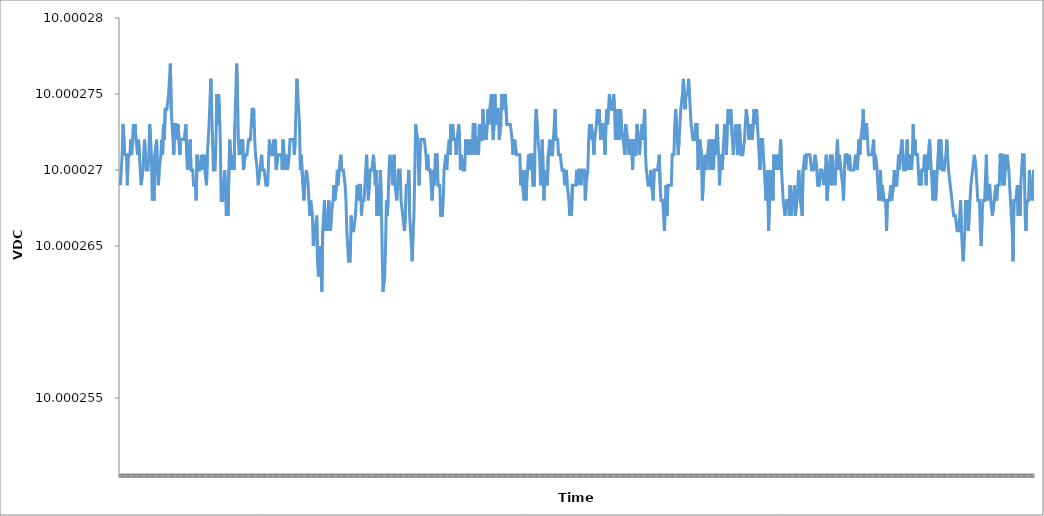
| Category | Channel 1 (VDC) |
|---|---|
| 0 | 10 |
| 1 | 10 |
| 2 | 10 |
| 3 | 10 |
| 4 | 10 |
| 5 | 10 |
| 6 | 10 |
| 7 | 10 |
| 8 | 10 |
| 9 | 10 |
| 10 | 10 |
| 11 | 10 |
| 12 | 10 |
| 13 | 10 |
| 14 | 10 |
| 15 | 10 |
| 16 | 10 |
| 17 | 10 |
| 18 | 10 |
| 19 | 10 |
| 20 | 10 |
| 21 | 10 |
| 22 | 10 |
| 23 | 10 |
| 24 | 10 |
| 25 | 10 |
| 26 | 10 |
| 27 | 10 |
| 28 | 10 |
| 29 | 10 |
| 30 | 10 |
| 31 | 10 |
| 32 | 10 |
| 33 | 10 |
| 34 | 10 |
| 35 | 10 |
| 36 | 10 |
| 37 | 10 |
| 38 | 10 |
| 39 | 10 |
| 40 | 10 |
| 41 | 10 |
| 42 | 10 |
| 43 | 10 |
| 44 | 10 |
| 45 | 10 |
| 46 | 10 |
| 47 | 10 |
| 48 | 10 |
| 49 | 10 |
| 50 | 10 |
| 51 | 10 |
| 52 | 10 |
| 53 | 10 |
| 54 | 10 |
| 55 | 10 |
| 56 | 10 |
| 57 | 10 |
| 58 | 10 |
| 59 | 10 |
| 60 | 10 |
| 61 | 10 |
| 62 | 10 |
| 63 | 10 |
| 64 | 10 |
| 65 | 10 |
| 66 | 10 |
| 67 | 10 |
| 68 | 10 |
| 69 | 10 |
| 70 | 10 |
| 71 | 10 |
| 72 | 10 |
| 73 | 10 |
| 74 | 10 |
| 75 | 10 |
| 76 | 10 |
| 77 | 10 |
| 78 | 10 |
| 79 | 10 |
| 80 | 10 |
| 81 | 10 |
| 82 | 10 |
| 83 | 10 |
| 84 | 10 |
| 85 | 10 |
| 86 | 10 |
| 87 | 10 |
| 88 | 10 |
| 89 | 10 |
| 90 | 10 |
| 91 | 10 |
| 92 | 10 |
| 93 | 10 |
| 94 | 10 |
| 95 | 10 |
| 96 | 10 |
| 97 | 10 |
| 98 | 10 |
| 99 | 10 |
| 100 | 10 |
| 101 | 10 |
| 102 | 10 |
| 103 | 10 |
| 104 | 10 |
| 105 | 10 |
| 106 | 10 |
| 107 | 10 |
| 108 | 10 |
| 109 | 10 |
| 110 | 10 |
| 111 | 10 |
| 112 | 10 |
| 113 | 10 |
| 114 | 10 |
| 115 | 10 |
| 116 | 10 |
| 117 | 10 |
| 118 | 10 |
| 119 | 10 |
| 120 | 10 |
| 121 | 10 |
| 122 | 10 |
| 123 | 10 |
| 124 | 10 |
| 125 | 10 |
| 126 | 10 |
| 127 | 10 |
| 128 | 10 |
| 129 | 10 |
| 130 | 10 |
| 131 | 10 |
| 132 | 10 |
| 133 | 10 |
| 134 | 10 |
| 135 | 10 |
| 136 | 10 |
| 137 | 10 |
| 138 | 10 |
| 139 | 10 |
| 140 | 10 |
| 141 | 10 |
| 142 | 10 |
| 143 | 10 |
| 144 | 10 |
| 145 | 10 |
| 146 | 10 |
| 147 | 10 |
| 148 | 10 |
| 149 | 10 |
| 150 | 10 |
| 151 | 10 |
| 152 | 10 |
| 153 | 10 |
| 154 | 10 |
| 155 | 10 |
| 156 | 10 |
| 157 | 10 |
| 158 | 10 |
| 159 | 10 |
| 160 | 10 |
| 161 | 10 |
| 162 | 10 |
| 163 | 10 |
| 164 | 10 |
| 165 | 10 |
| 166 | 10 |
| 167 | 10 |
| 168 | 10 |
| 169 | 10 |
| 170 | 10 |
| 171 | 10 |
| 172 | 10 |
| 173 | 10 |
| 174 | 10 |
| 175 | 10 |
| 176 | 10 |
| 177 | 10 |
| 178 | 10 |
| 179 | 10 |
| 180 | 10 |
| 181 | 10 |
| 182 | 10 |
| 183 | 10 |
| 184 | 10 |
| 185 | 10 |
| 186 | 10 |
| 187 | 10 |
| 188 | 10 |
| 189 | 10 |
| 190 | 10 |
| 191 | 10 |
| 192 | 10 |
| 193 | 10 |
| 194 | 10 |
| 195 | 10 |
| 196 | 10 |
| 197 | 10 |
| 198 | 10 |
| 199 | 10 |
| 200 | 10 |
| 201 | 10 |
| 202 | 10 |
| 203 | 10 |
| 204 | 10 |
| 205 | 10 |
| 206 | 10 |
| 207 | 10 |
| 208 | 10 |
| 209 | 10 |
| 210 | 10 |
| 211 | 10 |
| 212 | 10 |
| 213 | 10 |
| 214 | 10 |
| 215 | 10 |
| 216 | 10 |
| 217 | 10 |
| 218 | 10 |
| 219 | 10 |
| 220 | 10 |
| 221 | 10 |
| 222 | 10 |
| 223 | 10 |
| 224 | 10 |
| 225 | 10 |
| 226 | 10 |
| 227 | 10 |
| 228 | 10 |
| 229 | 10 |
| 230 | 10 |
| 231 | 10 |
| 232 | 10 |
| 233 | 10 |
| 234 | 10 |
| 235 | 10 |
| 236 | 10 |
| 237 | 10 |
| 238 | 10 |
| 239 | 10 |
| 240 | 10 |
| 241 | 10 |
| 242 | 10 |
| 243 | 10 |
| 244 | 10 |
| 245 | 10 |
| 246 | 10 |
| 247 | 10 |
| 248 | 10 |
| 249 | 10 |
| 250 | 10 |
| 251 | 10 |
| 252 | 10 |
| 253 | 10 |
| 254 | 10 |
| 255 | 10 |
| 256 | 10 |
| 257 | 10 |
| 258 | 10 |
| 259 | 10 |
| 260 | 10 |
| 261 | 10 |
| 262 | 10 |
| 263 | 10 |
| 264 | 10 |
| 265 | 10 |
| 266 | 10 |
| 267 | 10 |
| 268 | 10 |
| 269 | 10 |
| 270 | 10 |
| 271 | 10 |
| 272 | 10 |
| 273 | 10 |
| 274 | 10 |
| 275 | 10 |
| 276 | 10 |
| 277 | 10 |
| 278 | 10 |
| 279 | 10 |
| 280 | 10 |
| 281 | 10 |
| 282 | 10 |
| 283 | 10 |
| 284 | 10 |
| 285 | 10 |
| 286 | 10 |
| 287 | 10 |
| 288 | 10 |
| 289 | 10 |
| 290 | 10 |
| 291 | 10 |
| 292 | 10 |
| 293 | 10 |
| 294 | 10 |
| 295 | 10 |
| 296 | 10 |
| 297 | 10 |
| 298 | 10 |
| 299 | 10 |
| 300 | 10 |
| 301 | 10 |
| 302 | 10 |
| 303 | 10 |
| 304 | 10 |
| 305 | 10 |
| 306 | 10 |
| 307 | 10 |
| 308 | 10 |
| 309 | 10 |
| 310 | 10 |
| 311 | 10 |
| 312 | 10 |
| 313 | 10 |
| 314 | 10 |
| 315 | 10 |
| 316 | 10 |
| 317 | 10 |
| 318 | 10 |
| 319 | 10 |
| 320 | 10 |
| 321 | 10 |
| 322 | 10 |
| 323 | 10 |
| 324 | 10 |
| 325 | 10 |
| 326 | 10 |
| 327 | 10 |
| 328 | 10 |
| 329 | 10 |
| 330 | 10 |
| 331 | 10 |
| 332 | 10 |
| 333 | 10 |
| 334 | 10 |
| 335 | 10 |
| 336 | 10 |
| 337 | 10 |
| 338 | 10 |
| 339 | 10 |
| 340 | 10 |
| 341 | 10 |
| 342 | 10 |
| 343 | 10 |
| 344 | 10 |
| 345 | 10 |
| 346 | 10 |
| 347 | 10 |
| 348 | 10 |
| 349 | 10 |
| 350 | 10 |
| 351 | 10 |
| 352 | 10 |
| 353 | 10 |
| 354 | 10 |
| 355 | 10 |
| 356 | 10 |
| 357 | 10 |
| 358 | 10 |
| 359 | 10 |
| 360 | 10 |
| 361 | 10 |
| 362 | 10 |
| 363 | 10 |
| 364 | 10 |
| 365 | 10 |
| 366 | 10 |
| 367 | 10 |
| 368 | 10 |
| 369 | 10 |
| 370 | 10 |
| 371 | 10 |
| 372 | 10 |
| 373 | 10 |
| 374 | 10 |
| 375 | 10 |
| 376 | 10 |
| 377 | 10 |
| 378 | 10 |
| 379 | 10 |
| 380 | 10 |
| 381 | 10 |
| 382 | 10 |
| 383 | 10 |
| 384 | 10 |
| 385 | 10 |
| 386 | 10 |
| 387 | 10 |
| 388 | 10 |
| 389 | 10 |
| 390 | 10 |
| 391 | 10 |
| 392 | 10 |
| 393 | 10 |
| 394 | 10 |
| 395 | 10 |
| 396 | 10 |
| 397 | 10 |
| 398 | 10 |
| 399 | 10 |
| 400 | 10 |
| 401 | 10 |
| 402 | 10 |
| 403 | 10 |
| 404 | 10 |
| 405 | 10 |
| 406 | 10 |
| 407 | 10 |
| 408 | 10 |
| 409 | 10 |
| 410 | 10 |
| 411 | 10 |
| 412 | 10 |
| 413 | 10 |
| 414 | 10 |
| 415 | 10 |
| 416 | 10 |
| 417 | 10 |
| 418 | 10 |
| 419 | 10 |
| 420 | 10 |
| 421 | 10 |
| 422 | 10 |
| 423 | 10 |
| 424 | 10 |
| 425 | 10 |
| 426 | 10 |
| 427 | 10 |
| 428 | 10 |
| 429 | 10 |
| 430 | 10 |
| 431 | 10 |
| 432 | 10 |
| 433 | 10 |
| 434 | 10 |
| 435 | 10 |
| 436 | 10 |
| 437 | 10 |
| 438 | 10 |
| 439 | 10 |
| 440 | 10 |
| 441 | 10 |
| 442 | 10 |
| 443 | 10 |
| 444 | 10 |
| 445 | 10 |
| 446 | 10 |
| 447 | 10 |
| 448 | 10 |
| 449 | 10 |
| 450 | 10 |
| 451 | 10 |
| 452 | 10 |
| 453 | 10 |
| 454 | 10 |
| 455 | 10 |
| 456 | 10 |
| 457 | 10 |
| 458 | 10 |
| 459 | 10 |
| 460 | 10 |
| 461 | 10 |
| 462 | 10 |
| 463 | 10 |
| 464 | 10 |
| 465 | 10 |
| 466 | 10 |
| 467 | 10 |
| 468 | 10 |
| 469 | 10 |
| 470 | 10 |
| 471 | 10 |
| 472 | 10 |
| 473 | 10 |
| 474 | 10 |
| 475 | 10 |
| 476 | 10 |
| 477 | 10 |
| 478 | 10 |
| 479 | 10 |
| 480 | 10 |
| 481 | 10 |
| 482 | 10 |
| 483 | 10 |
| 484 | 10 |
| 485 | 10 |
| 486 | 10 |
| 487 | 10 |
| 488 | 10 |
| 489 | 10 |
| 490 | 10 |
| 491 | 10 |
| 492 | 10 |
| 493 | 10 |
| 494 | 10 |
| 495 | 10 |
| 496 | 10 |
| 497 | 10 |
| 498 | 10 |
| 499 | 10 |
| 500 | 10 |
| 501 | 10 |
| 502 | 10 |
| 503 | 10 |
| 504 | 10 |
| 505 | 10 |
| 506 | 10 |
| 507 | 10 |
| 508 | 10 |
| 509 | 10 |
| 510 | 10 |
| 511 | 10 |
| 512 | 10 |
| 513 | 10 |
| 514 | 10 |
| 515 | 10 |
| 516 | 10 |
| 517 | 10 |
| 518 | 10 |
| 519 | 10 |
| 520 | 10 |
| 521 | 10 |
| 522 | 10 |
| 523 | 10 |
| 524 | 10 |
| 525 | 10 |
| 526 | 10 |
| 527 | 10 |
| 528 | 10 |
| 529 | 10 |
| 530 | 10 |
| 531 | 10 |
| 532 | 10 |
| 533 | 10 |
| 534 | 10 |
| 535 | 10 |
| 536 | 10 |
| 537 | 10 |
| 538 | 10 |
| 539 | 10 |
| 540 | 10 |
| 541 | 10 |
| 542 | 10 |
| 543 | 10 |
| 544 | 10 |
| 545 | 10 |
| 546 | 10 |
| 547 | 10 |
| 548 | 10 |
| 549 | 10 |
| 550 | 10 |
| 551 | 10 |
| 552 | 10 |
| 553 | 10 |
| 554 | 10 |
| 555 | 10 |
| 556 | 10 |
| 557 | 10 |
| 558 | 10 |
| 559 | 10 |
| 560 | 10 |
| 561 | 10 |
| 562 | 10 |
| 563 | 10 |
| 564 | 10 |
| 565 | 10 |
| 566 | 10 |
| 567 | 10 |
| 568 | 10 |
| 569 | 10 |
| 570 | 10 |
| 571 | 10 |
| 572 | 10 |
| 573 | 10 |
| 574 | 10 |
| 575 | 10 |
| 576 | 10 |
| 577 | 10 |
| 578 | 10 |
| 579 | 10 |
| 580 | 10 |
| 581 | 10 |
| 582 | 10 |
| 583 | 10 |
| 584 | 10 |
| 585 | 10 |
| 586 | 10 |
| 587 | 10 |
| 588 | 10 |
| 589 | 10 |
| 590 | 10 |
| 591 | 10 |
| 592 | 10 |
| 593 | 10 |
| 594 | 10 |
| 595 | 10 |
| 596 | 10 |
| 597 | 10 |
| 598 | 10 |
| 599 | 10 |
| 600 | 10 |
| 601 | 10 |
| 602 | 10 |
| 603 | 10 |
| 604 | 10 |
| 605 | 10 |
| 606 | 10 |
| 607 | 10 |
| 608 | 10 |
| 609 | 10 |
| 610 | 10 |
| 611 | 10 |
| 612 | 10 |
| 613 | 10 |
| 614 | 10 |
| 615 | 10 |
| 616 | 10 |
| 617 | 10 |
| 618 | 10 |
| 619 | 10 |
| 620 | 10 |
| 621 | 10 |
| 622 | 10 |
| 623 | 10 |
| 624 | 10 |
| 625 | 10 |
| 626 | 10 |
| 627 | 10 |
| 628 | 10 |
| 629 | 10 |
| 630 | 10 |
| 631 | 10 |
| 632 | 10 |
| 633 | 10 |
| 634 | 10 |
| 635 | 10 |
| 636 | 10 |
| 637 | 10 |
| 638 | 10 |
| 639 | 10 |
| 640 | 10 |
| 641 | 10 |
| 642 | 10 |
| 643 | 10 |
| 644 | 10 |
| 645 | 10 |
| 646 | 10 |
| 647 | 10 |
| 648 | 10 |
| 649 | 10 |
| 650 | 10 |
| 651 | 10 |
| 652 | 10 |
| 653 | 10 |
| 654 | 10 |
| 655 | 10 |
| 656 | 10 |
| 657 | 10 |
| 658 | 10 |
| 659 | 10 |
| 660 | 10 |
| 661 | 10 |
| 662 | 10 |
| 663 | 10 |
| 664 | 10 |
| 665 | 10 |
| 666 | 10 |
| 667 | 10 |
| 668 | 10 |
| 669 | 10 |
| 670 | 10 |
| 671 | 10 |
| 672 | 10 |
| 673 | 10 |
| 674 | 10 |
| 675 | 10 |
| 676 | 10 |
| 677 | 10 |
| 678 | 10 |
| 679 | 10 |
| 680 | 10 |
| 681 | 10 |
| 682 | 10 |
| 683 | 10 |
| 684 | 10 |
| 685 | 10 |
| 686 | 10 |
| 687 | 10 |
| 688 | 10 |
| 689 | 10 |
| 690 | 10 |
| 691 | 10 |
| 692 | 10 |
| 693 | 10 |
| 694 | 10 |
| 695 | 10 |
| 696 | 10 |
| 697 | 10 |
| 698 | 10 |
| 699 | 10 |
| 700 | 10 |
| 701 | 10 |
| 702 | 10 |
| 703 | 10 |
| 704 | 10 |
| 705 | 10 |
| 706 | 10 |
| 707 | 10 |
| 708 | 10 |
| 709 | 10 |
| 710 | 10 |
| 711 | 10 |
| 712 | 10 |
| 713 | 10 |
| 714 | 10 |
| 715 | 10 |
| 716 | 10 |
| 717 | 10 |
| 718 | 10 |
| 719 | 10 |
| 720 | 10 |
| 721 | 10 |
| 722 | 10 |
| 723 | 10 |
| 724 | 10 |
| 725 | 10 |
| 726 | 10 |
| 727 | 10 |
| 728 | 10 |
| 729 | 10 |
| 730 | 10 |
| 731 | 10 |
| 732 | 10 |
| 733 | 10 |
| 734 | 10 |
| 735 | 10 |
| 736 | 10 |
| 737 | 10 |
| 738 | 10 |
| 739 | 10 |
| 740 | 10 |
| 741 | 10 |
| 742 | 10 |
| 743 | 10 |
| 744 | 10 |
| 745 | 10 |
| 746 | 10 |
| 747 | 10 |
| 748 | 10 |
| 749 | 10 |
| 750 | 10 |
| 751 | 10 |
| 752 | 10 |
| 753 | 10 |
| 754 | 10 |
| 755 | 10 |
| 756 | 10 |
| 757 | 10 |
| 758 | 10 |
| 759 | 10 |
| 760 | 10 |
| 761 | 10 |
| 762 | 10 |
| 763 | 10 |
| 764 | 10 |
| 765 | 10 |
| 766 | 10 |
| 767 | 10 |
| 768 | 10 |
| 769 | 10 |
| 770 | 10 |
| 771 | 10 |
| 772 | 10 |
| 773 | 10 |
| 774 | 10 |
| 775 | 10 |
| 776 | 10 |
| 777 | 10 |
| 778 | 10 |
| 779 | 10 |
| 780 | 10 |
| 781 | 10 |
| 782 | 10 |
| 783 | 10 |
| 784 | 10 |
| 785 | 10 |
| 786 | 10 |
| 787 | 10 |
| 788 | 10 |
| 789 | 10 |
| 790 | 10 |
| 791 | 10 |
| 792 | 10 |
| 793 | 10 |
| 794 | 10 |
| 795 | 10 |
| 796 | 10 |
| 797 | 10 |
| 798 | 10 |
| 799 | 10 |
| 800 | 10 |
| 801 | 10 |
| 802 | 10 |
| 803 | 10 |
| 804 | 10 |
| 805 | 10 |
| 806 | 10 |
| 807 | 10 |
| 808 | 10 |
| 809 | 10 |
| 810 | 10 |
| 811 | 10 |
| 812 | 10 |
| 813 | 10 |
| 814 | 10 |
| 815 | 10 |
| 816 | 10 |
| 817 | 10 |
| 818 | 10 |
| 819 | 10 |
| 820 | 10 |
| 821 | 10 |
| 822 | 10 |
| 823 | 10 |
| 824 | 10 |
| 825 | 10 |
| 826 | 10 |
| 827 | 10 |
| 828 | 10 |
| 829 | 10 |
| 830 | 10 |
| 831 | 10 |
| 832 | 10 |
| 833 | 10 |
| 834 | 10 |
| 835 | 10 |
| 836 | 10 |
| 837 | 10 |
| 838 | 10 |
| 839 | 10 |
| 840 | 10 |
| 841 | 10 |
| 842 | 10 |
| 843 | 10 |
| 844 | 10 |
| 845 | 10 |
| 846 | 10 |
| 847 | 10 |
| 848 | 10 |
| 849 | 10 |
| 850 | 10 |
| 851 | 10 |
| 852 | 10 |
| 853 | 10 |
| 854 | 10 |
| 855 | 10 |
| 856 | 10 |
| 857 | 10 |
| 858 | 10 |
| 859 | 10 |
| 860 | 10 |
| 861 | 10 |
| 862 | 10 |
| 863 | 10 |
| 864 | 10 |
| 865 | 10 |
| 866 | 10 |
| 867 | 10 |
| 868 | 10 |
| 869 | 10 |
| 870 | 10 |
| 871 | 10 |
| 872 | 10 |
| 873 | 10 |
| 874 | 10 |
| 875 | 10 |
| 876 | 10 |
| 877 | 10 |
| 878 | 10 |
| 879 | 10 |
| 880 | 10 |
| 881 | 10 |
| 882 | 10 |
| 883 | 10 |
| 884 | 10 |
| 885 | 10 |
| 886 | 10 |
| 887 | 10 |
| 888 | 10 |
| 889 | 10 |
| 890 | 10 |
| 891 | 10 |
| 892 | 10 |
| 893 | 10 |
| 894 | 10 |
| 895 | 10 |
| 896 | 10 |
| 897 | 10 |
| 898 | 10 |
| 899 | 10 |
| 900 | 10 |
| 901 | 10 |
| 902 | 10 |
| 903 | 10 |
| 904 | 10 |
| 905 | 10 |
| 906 | 10 |
| 907 | 10 |
| 908 | 10 |
| 909 | 10 |
| 910 | 10 |
| 911 | 10 |
| 912 | 10 |
| 913 | 10 |
| 914 | 10 |
| 915 | 10 |
| 916 | 10 |
| 917 | 10 |
| 918 | 10 |
| 919 | 10 |
| 920 | 10 |
| 921 | 10 |
| 922 | 10 |
| 923 | 10 |
| 924 | 10 |
| 925 | 10 |
| 926 | 10 |
| 927 | 10 |
| 928 | 10 |
| 929 | 10 |
| 930 | 10 |
| 931 | 10 |
| 932 | 10 |
| 933 | 10 |
| 934 | 10 |
| 935 | 10 |
| 936 | 10 |
| 937 | 10 |
| 938 | 10 |
| 939 | 10 |
| 940 | 10 |
| 941 | 10 |
| 942 | 10 |
| 943 | 10 |
| 944 | 10 |
| 945 | 10 |
| 946 | 10 |
| 947 | 10 |
| 948 | 10 |
| 949 | 10 |
| 950 | 10 |
| 951 | 10 |
| 952 | 10 |
| 953 | 10 |
| 954 | 10 |
| 955 | 10 |
| 956 | 10 |
| 957 | 10 |
| 958 | 10 |
| 959 | 10 |
| 960 | 10 |
| 961 | 10 |
| 962 | 10 |
| 963 | 10 |
| 964 | 10 |
| 965 | 10 |
| 966 | 10 |
| 967 | 10 |
| 968 | 10 |
| 969 | 10 |
| 970 | 10 |
| 971 | 10 |
| 972 | 10 |
| 973 | 10 |
| 974 | 10 |
| 975 | 10 |
| 976 | 10 |
| 977 | 10 |
| 978 | 10 |
| 979 | 10 |
| 980 | 10 |
| 981 | 10 |
| 982 | 10 |
| 983 | 10 |
| 984 | 10 |
| 985 | 10 |
| 986 | 10 |
| 987 | 10 |
| 988 | 10 |
| 989 | 10 |
| 990 | 10 |
| 991 | 10 |
| 992 | 10 |
| 993 | 10 |
| 994 | 10 |
| 995 | 10 |
| 996 | 10 |
| 997 | 10 |
| 998 | 10 |
| 999 | 10 |
| 1000 | 10 |
| 1001 | 10 |
| 1002 | 10 |
| 1003 | 10 |
| 1004 | 10 |
| 1005 | 10 |
| 1006 | 10 |
| 1007 | 10 |
| 1008 | 10 |
| 1009 | 10 |
| 1010 | 10 |
| 1011 | 10 |
| 1012 | 10 |
| 1013 | 10 |
| 1014 | 10 |
| 1015 | 10 |
| 1016 | 10 |
| 1017 | 10 |
| 1018 | 10 |
| 1019 | 10 |
| 1020 | 10 |
| 1021 | 10 |
| 1022 | 10 |
| 1023 | 10 |
| 1024 | 10 |
| 1025 | 10 |
| 1026 | 10 |
| 1027 | 10 |
| 1028 | 10 |
| 1029 | 10 |
| 1030 | 10 |
| 1031 | 10 |
| 1032 | 10 |
| 1033 | 10 |
| 1034 | 10 |
| 1035 | 10 |
| 1036 | 10 |
| 1037 | 10 |
| 1038 | 10 |
| 1039 | 10 |
| 1040 | 10 |
| 1041 | 10 |
| 1042 | 10 |
| 1043 | 10 |
| 1044 | 10 |
| 1045 | 10 |
| 1046 | 10 |
| 1047 | 10 |
| 1048 | 10 |
| 1049 | 10 |
| 1050 | 10 |
| 1051 | 10 |
| 1052 | 10 |
| 1053 | 10 |
| 1054 | 10 |
| 1055 | 10 |
| 1056 | 10 |
| 1057 | 10 |
| 1058 | 10 |
| 1059 | 10 |
| 1060 | 10 |
| 1061 | 10 |
| 1062 | 10 |